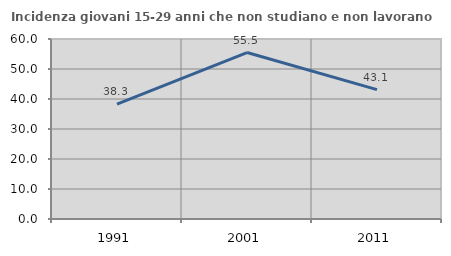
| Category | Incidenza giovani 15-29 anni che non studiano e non lavorano  |
|---|---|
| 1991.0 | 38.265 |
| 2001.0 | 55.486 |
| 2011.0 | 43.129 |